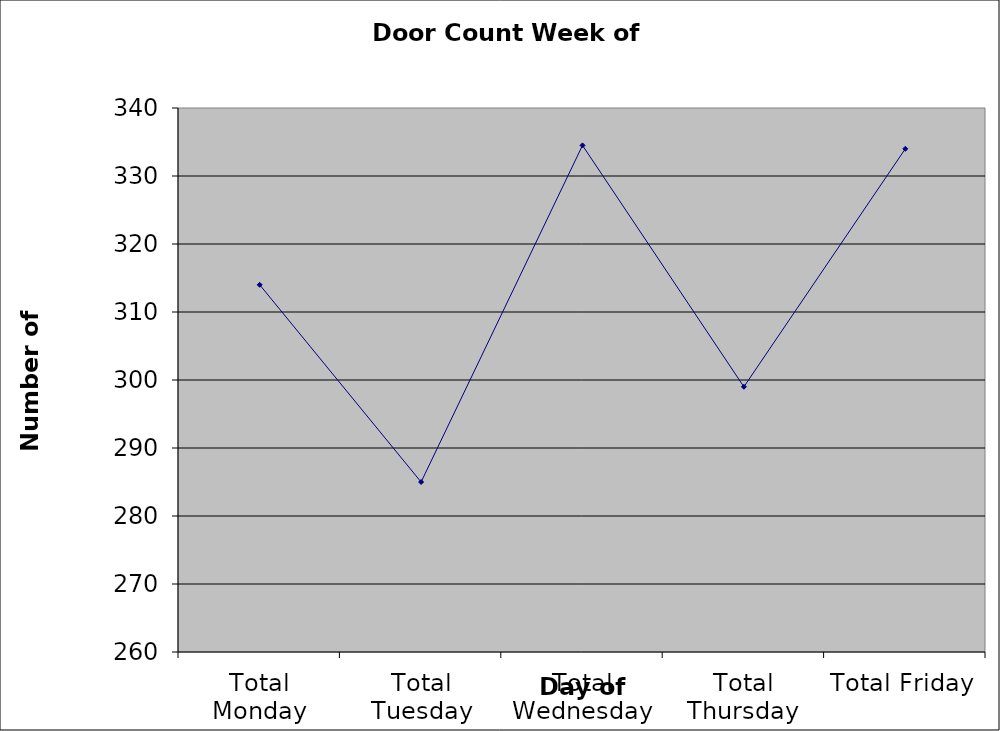
| Category | Series 0 |
|---|---|
| Total Monday | 314 |
| Total Tuesday | 285 |
| Total Wednesday | 334.5 |
| Total Thursday | 299 |
| Total Friday | 334 |